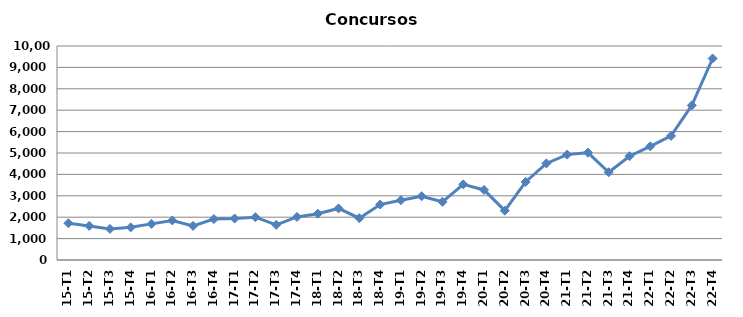
| Category | Concursos |
|---|---|
| 15-T1 | 1718 |
| 15-T2 | 1593 |
| 15-T3 | 1451 |
| 15-T4 | 1526 |
| 16-T1 | 1689 |
| 16-T2 | 1847 |
| 16-T3 | 1593 |
| 16-T4 | 1911 |
| 17-T1 | 1937 |
| 17-T2 | 2001 |
| 17-T3 | 1645 |
| 17-T4 | 2011 |
| 18-T1 | 2162 |
| 18-T2 | 2410 |
| 18-T3 | 1953 |
| 18-T4 | 2590 |
| 19-T1 | 2796 |
| 19-T2 | 2982 |
| 19-T3 | 2719 |
| 19-T4 | 3534 |
| 20-T1 | 3274 |
| 20-T2 | 2305 |
| 20-T3 | 3649 |
| 20-T4 | 4513 |
| 21-T1 | 4925 |
| 21-T2 | 5017 |
| 21-T3 | 4101 |
| 21-T4 | 4849 |
| 22-T1 | 5312 |
| 22-T2 | 5798 |
| 22-T3 | 7225 |
| 22-T4 | 9416 |